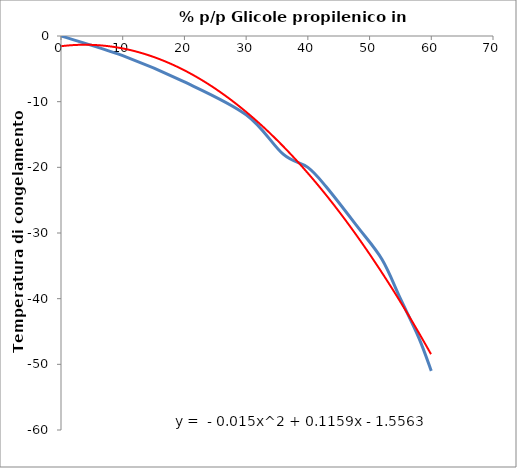
| Category | Series 0 |
|---|---|
| 0.0 | 0 |
| 10.0 | -3 |
| 20.0 | -7 |
| 30.0 | -12 |
| 36.0 | -18 |
| 40.0 | -20 |
| 43.0 | -23 |
| 48.0 | -29 |
| 52.0 | -34 |
| 55.0 | -40 |
| 58.0 | -46 |
| 60.0 | -51 |